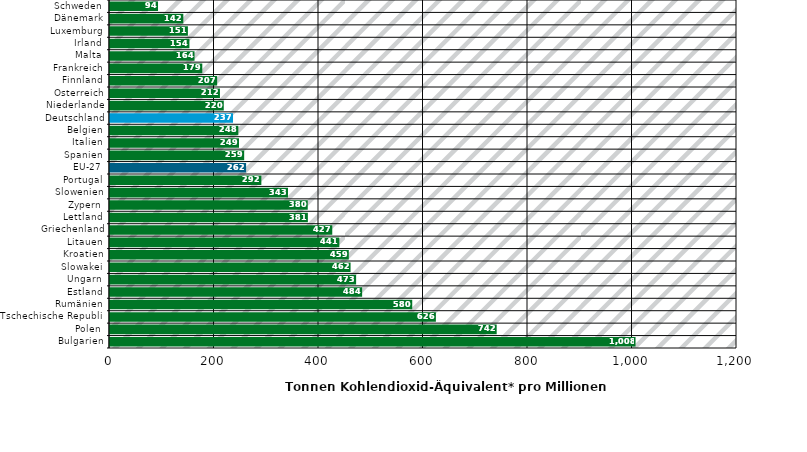
| Category | 2021 |
|---|---|
| Bulgarien | 1007.735 |
| Polen | 741.979 |
| Tschechische Republik | 625.635 |
| Rumänien | 580.355 |
| Estland | 484.468 |
| Ungarn | 472.953 |
| Slowakei | 462.348 |
| Kroatien | 458.942 |
| Litauen | 440.848 |
| Griechenland | 427.305 |
| Lettland | 380.631 |
| Zypern | 380.365 |
| Slowenien | 342.579 |
| Portugal | 291.579 |
| EU-27 | 262.4 |
| Spanien | 258.707 |
| Italien | 248.79 |
| Belgien | 247.514 |
| Deutschland | 237.329 |
| Niederlande | 219.651 |
| Österreich | 212.326 |
| Finnland | 206.978 |
| Frankreich | 178.549 |
| Malta | 163.683 |
| Irland | 153.895 |
| Luxemburg | 151.015 |
| Dänemark | 142.232 |
| Schweden | 93.817 |